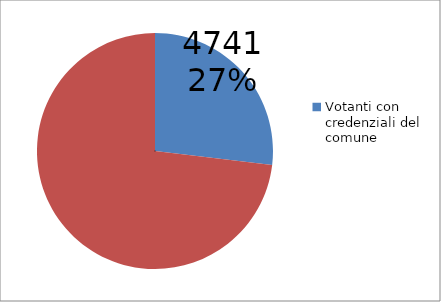
| Category | Series 0 |
|---|---|
| Votanti con credenziali del comune | 4741 |